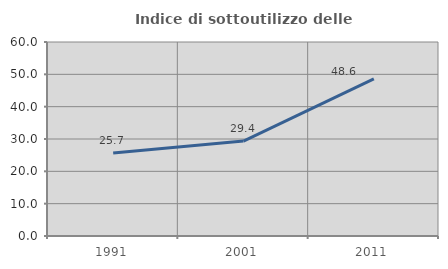
| Category | Indice di sottoutilizzo delle abitazioni  |
|---|---|
| 1991.0 | 25.701 |
| 2001.0 | 29.362 |
| 2011.0 | 48.606 |